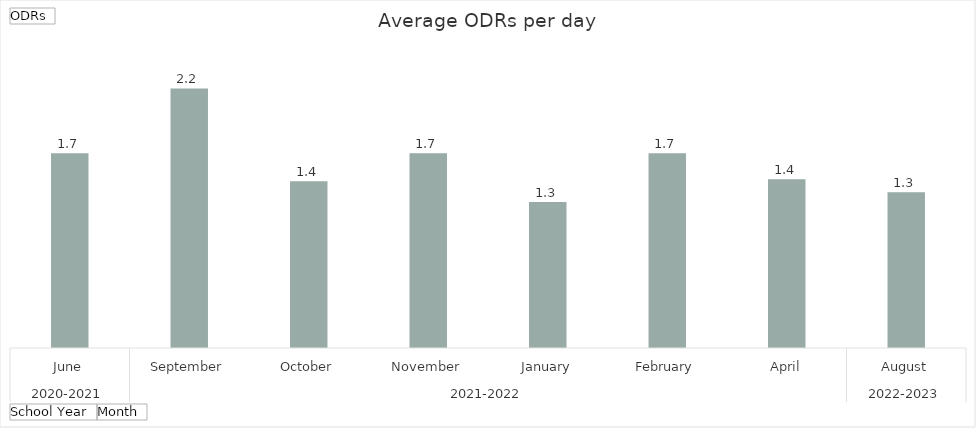
| Category | Total |
|---|---|
| 0 | 1.667 |
| 1 | 2.222 |
| 2 | 1.429 |
| 3 | 1.667 |
| 4 | 1.25 |
| 5 | 1.667 |
| 6 | 1.444 |
| 7 | 1.333 |